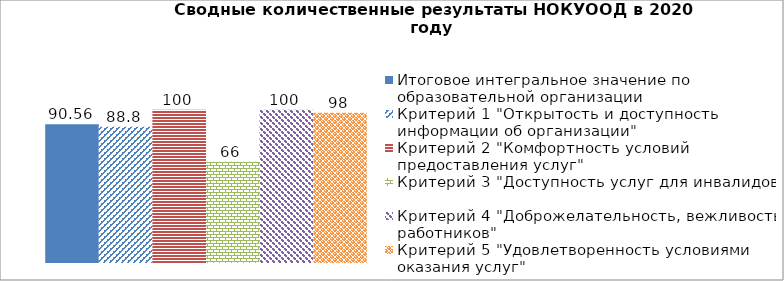
| Category | Итоговое интегральное значение по образовательной организации | Критерий 1 "Открытость и доступность информации об организации" | Критерий 2 "Комфортность условий предоставления услуг" | Критерий 3 "Доступность услуг для инвалидов" | Критерий 4 "Доброжелательность, вежливость работников" | Критерий 5 "Удовлетворенность условиями оказания услуг" |
|---|---|---|---|---|---|---|
| 0 | 90.56 | 88.8 | 100 | 66 | 100 | 98 |